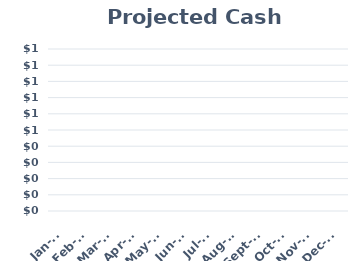
| Category | Projected Cash Flow |
|---|---|
| 2021-01-01 | 0 |
| 2021-02-01 | 0 |
| 2021-03-01 | 0 |
| 2021-04-01 | 0 |
| 2021-05-01 | 0 |
| 2021-06-01 | 0 |
| 2021-07-01 | 0 |
| 2021-08-01 | 0 |
| 2021-09-01 | 0 |
| 2021-10-01 | 0 |
| 2021-11-01 | 0 |
| 2021-12-01 | 0 |